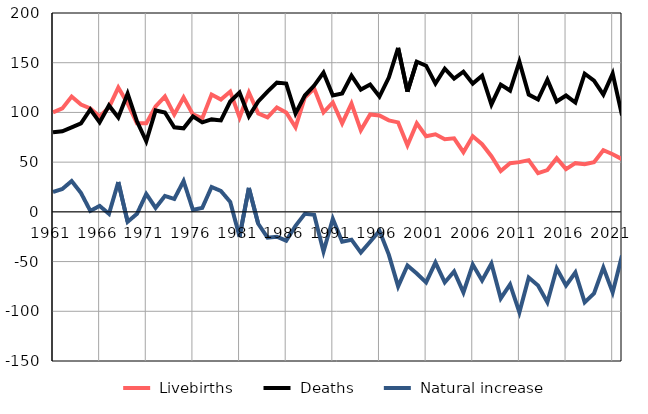
| Category |  Livebirths |  Deaths |  Natural increase |
|---|---|---|---|
| 1961.0 | 100 | 80 | 20 |
| 1962.0 | 104 | 81 | 23 |
| 1963.0 | 116 | 85 | 31 |
| 1964.0 | 108 | 89 | 19 |
| 1965.0 | 104 | 103 | 1 |
| 1966.0 | 96 | 90 | 6 |
| 1967.0 | 105 | 107 | -2 |
| 1968.0 | 125 | 95 | 30 |
| 1969.0 | 109 | 119 | -10 |
| 1970.0 | 89 | 91 | -2 |
| 1971.0 | 89 | 71 | 18 |
| 1972.0 | 106 | 102 | 4 |
| 1973.0 | 116 | 100 | 16 |
| 1974.0 | 98 | 85 | 13 |
| 1975.0 | 115 | 84 | 31 |
| 1976.0 | 98 | 96 | 2 |
| 1977.0 | 94 | 90 | 4 |
| 1978.0 | 118 | 93 | 25 |
| 1979.0 | 113 | 92 | 21 |
| 1980.0 | 121 | 111 | 10 |
| 1981.0 | 95 | 120 | -25 |
| 1982.0 | 120 | 96 | 24 |
| 1983.0 | 99 | 111 | -12 |
| 1984.0 | 95 | 121 | -26 |
| 1985.0 | 105 | 130 | -25 |
| 1986.0 | 100 | 129 | -29 |
| 1987.0 | 85 | 99 | -14 |
| 1988.0 | 115 | 117 | -2 |
| 1989.0 | 124 | 127 | -3 |
| 1990.0 | 100 | 140 | -40 |
| 1991.0 | 110 | 117 | -7 |
| 1992.0 | 89 | 119 | -30 |
| 1993.0 | 109 | 137 | -28 |
| 1994.0 | 82 | 123 | -41 |
| 1995.0 | 98 | 128 | -30 |
| 1996.0 | 97 | 116 | -19 |
| 1997.0 | 92 | 135 | -43 |
| 1998.0 | 90 | 165 | -75 |
| 1999.0 | 67 | 121 | -54 |
| 2000.0 | 89 | 151 | -62 |
| 2001.0 | 76 | 147 | -71 |
| 2002.0 | 78 | 129 | -51 |
| 2003.0 | 73 | 144 | -71 |
| 2004.0 | 74 | 134 | -60 |
| 2005.0 | 60 | 141 | -81 |
| 2006.0 | 76 | 129 | -53 |
| 2007.0 | 68 | 137 | -69 |
| 2008.0 | 56 | 108 | -52 |
| 2009.0 | 41 | 128 | -87 |
| 2010.0 | 49 | 122 | -73 |
| 2011.0 | 50 | 151 | -101 |
| 2012.0 | 52 | 118 | -66 |
| 2013.0 | 39 | 113 | -74 |
| 2014.0 | 42 | 133 | -91 |
| 2015.0 | 54 | 111 | -57 |
| 2016.0 | 43 | 117 | -74 |
| 2017.0 | 49 | 110 | -61 |
| 2018.0 | 48 | 139 | -91 |
| 2019.0 | 50 | 132 | -82 |
| 2020.0 | 62 | 118 | -56 |
| 2021.0 | 58 | 139 | -81 |
| 2022.0 | 53 | 97 | -44 |